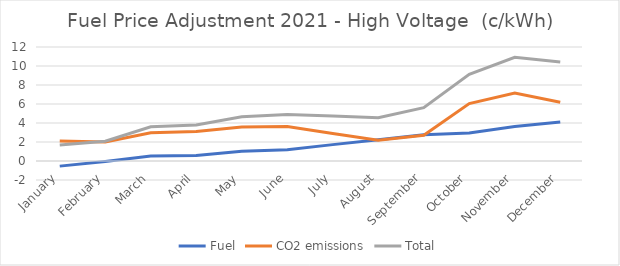
| Category | Fuel | CO2 emissions | Total |
|---|---|---|---|
| January | -0.54 | 2.099 | 1.687 |
| February | -0.057 | 2.013 | 2.078 |
| March | 0.518 | 2.981 | 3.601 |
| April | 0.585 | 3.118 | 3.801 |
| May | 1.019 | 3.569 | 4.657 |
| June | 1.185 | 3.624 | 4.882 |
| July | 1.724 | 2.896 | 4.741 |
| August | 2.249 | 2.182 | 4.544 |
| September | 2.769 | 2.715 | 5.612 |
| October | 2.954 | 6.045 | 9.129 |
| November | 3.622 | 7.163 | 10.919 |
| December | 4.113 | 6.188 | 10.431 |